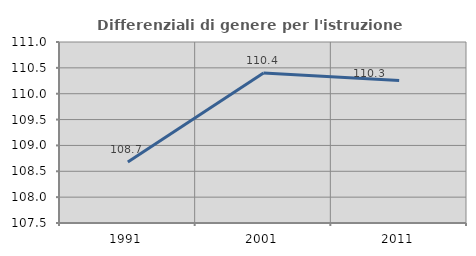
| Category | Differenziali di genere per l'istruzione superiore |
|---|---|
| 1991.0 | 108.679 |
| 2001.0 | 110.401 |
| 2011.0 | 110.254 |